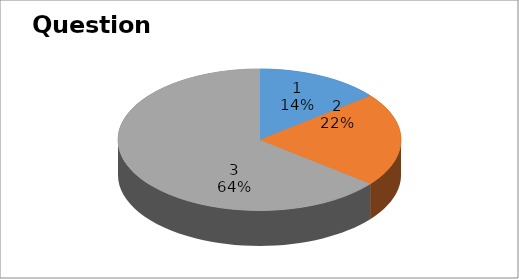
| Category | Series 0 |
|---|---|
| 0 | 4 |
| 1 | 6 |
| 2 | 18 |